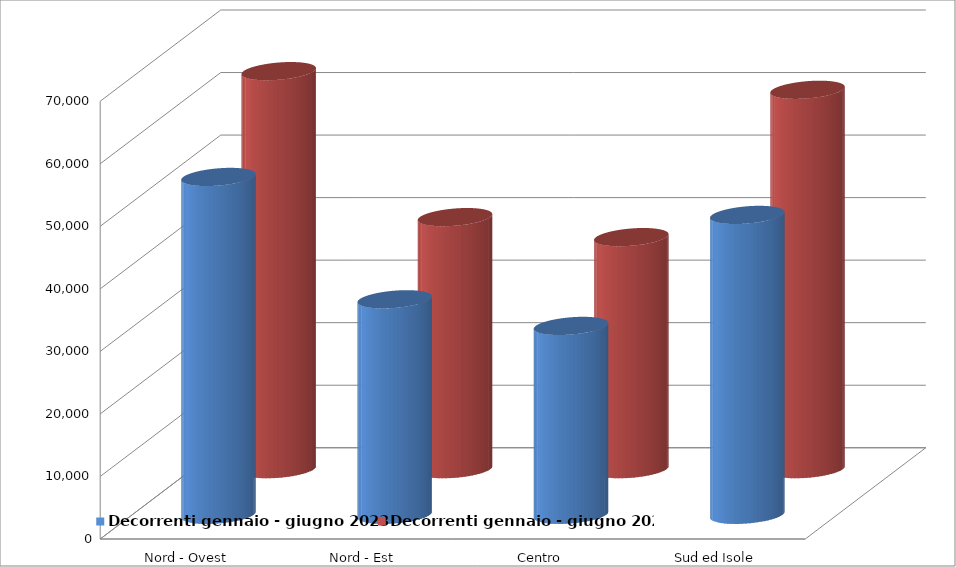
| Category | Decorrenti gennaio - giugno 2023 | Decorrenti gennaio - giugno 2022 |
|---|---|---|
| Nord - Ovest | 54027 | 63650 |
| Nord - Est | 34464 | 40309 |
| Centro | 30206 | 37110 |
| Sud ed Isole | 47955 | 60669 |